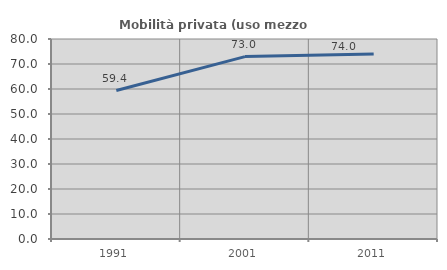
| Category | Mobilità privata (uso mezzo privato) |
|---|---|
| 1991.0 | 59.399 |
| 2001.0 | 72.955 |
| 2011.0 | 74.028 |